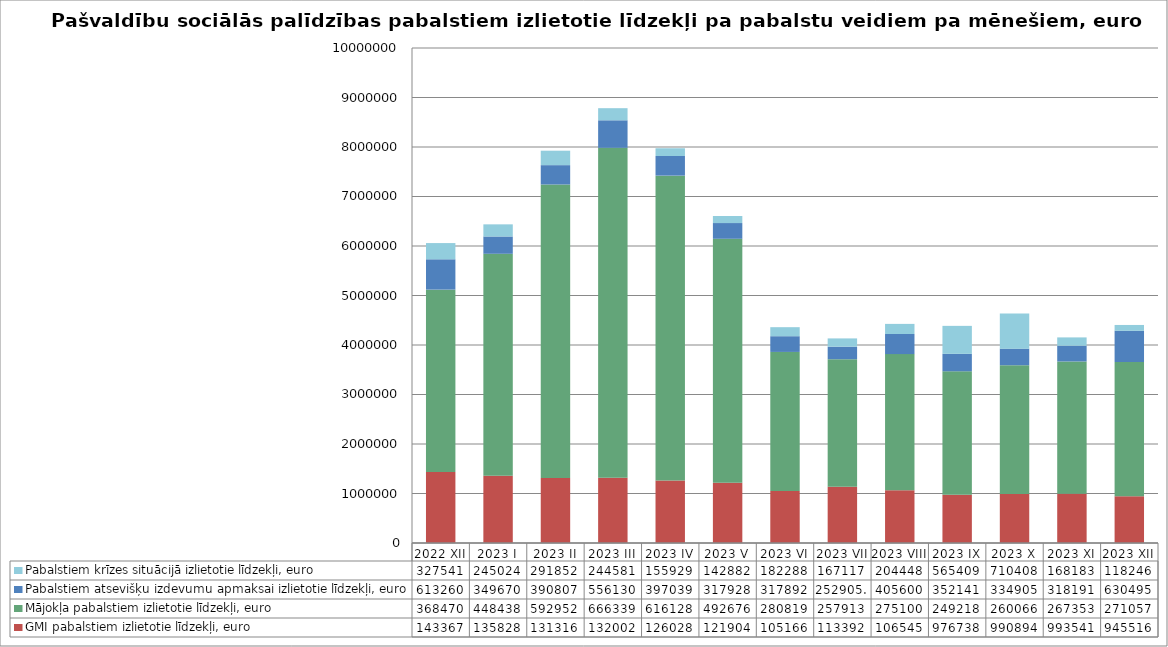
| Category | GMI pabalstiem izlietotie līdzekļi, euro | Mājokļa pabalstiem izlietotie līdzekļi, euro | Pabalstiem atsevišķu izdevumu apmaksai izlietotie līdzekļi, euro | Pabalstiem krīzes situācijā izlietotie līdzekļi, euro |
|---|---|---|---|---|
| 2022 XII | 1433674 | 3684701 | 613260 | 327541 |
| 2023 I | 1358282 | 4484384 | 349670 | 245024 |
| 2023 II | 1313168 | 5929524 | 390807 | 291852 |
| 2023 III | 1320028 | 6663392 | 556130 | 244581 |
| 2023 IV | 1260284 | 6161284 | 397039 | 155929 |
| 2023 V | 1219045 | 4926766 | 317928 | 142882 |
| 2023 VI | 1051662 | 2808191 | 317892 | 182288 |
| 2023 VII | 1133928 | 2579133.39 | 252905.97 | 167117 |
| 2023 VIII | 1065452 | 2751005 | 405600 | 204448 |
| 2023 IX | 976738 | 2492186 | 352141 | 565409 |
| 2023 X | 990894 | 2600664 | 334905 | 710408 |
| 2023 XI | 993541 | 2673538 | 318191 | 168183 |
| 2023 XII | 945516 | 2710572 | 630495 | 118246 |